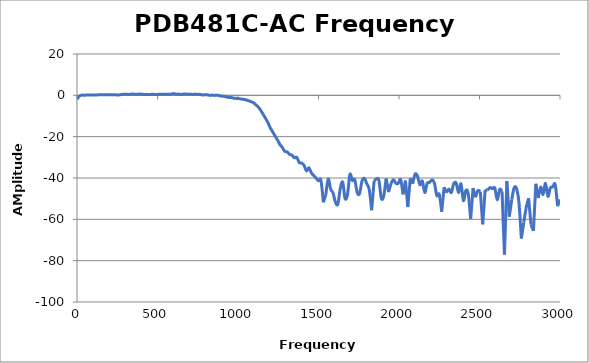
| Category | Series 0 |
|---|---|
| 0.3 | -1.872 |
| 15.2985 | -0.364 |
| 30.297 | 0.108 |
| 45.2955 | 0 |
| 60.294 | 0.183 |
| 75.2925 | 0.119 |
| 90.291 | 0.217 |
| 105.289 | 0.18 |
| 120.288 | 0.121 |
| 135.287 | 0.323 |
| 150.285 | 0.28 |
| 165.284 | 0.275 |
| 180.282 | 0.239 |
| 195.281 | 0.303 |
| 210.279 | 0.24 |
| 225.278 | 0.317 |
| 240.276 | 0.277 |
| 255.274 | 0.129 |
| 270.273 | 0.338 |
| 285.272 | 0.496 |
| 300.27 | 0.551 |
| 315.269 | 0.462 |
| 330.267 | 0.48 |
| 345.266 | 0.646 |
| 360.264 | 0.506 |
| 375.263 | 0.474 |
| 390.261 | 0.644 |
| 405.26 | 0.505 |
| 420.258 | 0.417 |
| 435.257 | 0.407 |
| 450.255 | 0.339 |
| 465.254 | 0.511 |
| 480.252 | 0.451 |
| 495.251 | 0.391 |
| 510.249 | 0.506 |
| 525.248 | 0.515 |
| 540.246 | 0.464 |
| 555.245 | 0.541 |
| 570.243 | 0.562 |
| 585.242 | 0.611 |
| 600.24 | 0.834 |
| 615.239 | 0.574 |
| 630.237 | 0.606 |
| 645.236 | 0.44 |
| 660.234 | 0.584 |
| 675.233 | 0.611 |
| 690.231 | 0.559 |
| 705.23 | 0.574 |
| 720.228 | 0.438 |
| 735.227 | 0.593 |
| 750.225 | 0.458 |
| 765.224 | 0.465 |
| 780.222 | 0.182 |
| 795.221 | 0.298 |
| 810.219 | 0.255 |
| 825.217 | -0.027 |
| 840.216 | 0.114 |
| 855.215 | -0.041 |
| 870.213 | 0.1 |
| 885.212 | -0.189 |
| 900.21 | -0.414 |
| 915.209 | -0.495 |
| 930.207 | -0.841 |
| 945.206 | -1.009 |
| 960.204 | -1.11 |
| 975.203 | -1.358 |
| 990.201 | -1.484 |
| 1005.2 | -1.559 |
| 1020.2 | -1.809 |
| 1035.2 | -1.921 |
| 1050.2 | -2.244 |
| 1065.19 | -2.606 |
| 1080.19 | -3.038 |
| 1095.19 | -3.515 |
| 1110.19 | -4.521 |
| 1125.19 | -5.61 |
| 1140.19 | -7.161 |
| 1155.19 | -9.089 |
| 1170.18 | -11.038 |
| 1185.18 | -13.131 |
| 1200.18 | -15.678 |
| 1215.18 | -17.662 |
| 1230.18 | -19.681 |
| 1245.18 | -21.585 |
| 1260.17 | -23.773 |
| 1275.17 | -25.226 |
| 1290.17 | -27.07 |
| 1305.17 | -27.368 |
| 1320.17 | -28.558 |
| 1335.17 | -28.951 |
| 1350.17 | -30.249 |
| 1365.16 | -29.988 |
| 1380.16 | -32.517 |
| 1395.16 | -32.796 |
| 1410.16 | -33.85 |
| 1425.16 | -36.584 |
| 1440.16 | -35.028 |
| 1455.16 | -37.396 |
| 1470.15 | -38.806 |
| 1485.15 | -40.083 |
| 1500.15 | -41.346 |
| 1515.15 | -41.13 |
| 1530.15 | -51.759 |
| 1545.15 | -48.193 |
| 1560.14 | -40.525 |
| 1575.14 | -45.349 |
| 1590.14 | -47.23 |
| 1605.14 | -51.652 |
| 1620.14 | -52.633 |
| 1635.14 | -45.167 |
| 1650.14 | -41.98 |
| 1665.13 | -49.95 |
| 1680.13 | -47.955 |
| 1695.13 | -38.245 |
| 1710.13 | -41.137 |
| 1725.13 | -40.838 |
| 1740.13 | -47.031 |
| 1755.12 | -47.505 |
| 1770.12 | -41.475 |
| 1785.12 | -40.2 |
| 1800.12 | -42.837 |
| 1815.12 | -45.61 |
| 1830.12 | -55.594 |
| 1845.12 | -41.489 |
| 1860.11 | -40.45 |
| 1875.11 | -41.195 |
| 1890.11 | -49.722 |
| 1905.11 | -48.725 |
| 1920.11 | -40.266 |
| 1935.11 | -46.824 |
| 1950.11 | -42.849 |
| 1965.1 | -40.803 |
| 1980.1 | -42.513 |
| 1995.1 | -42.611 |
| 2010.1 | -40.755 |
| 2025.1 | -47.937 |
| 2040.1 | -41.25 |
| 2055.1 | -54.066 |
| 2070.09 | -40.128 |
| 2085.09 | -42.739 |
| 2100.09 | -38.09 |
| 2115.09 | -39.144 |
| 2130.09 | -43.309 |
| 2145.09 | -41.459 |
| 2160.08 | -47.038 |
| 2175.08 | -42.557 |
| 2190.08 | -42.103 |
| 2205.08 | -40.94 |
| 2220.08 | -42.58 |
| 2235.08 | -48.531 |
| 2250.08 | -47.949 |
| 2265.07 | -56.328 |
| 2280.07 | -44.499 |
| 2295.07 | -47.084 |
| 2310.07 | -45.317 |
| 2325.07 | -47.035 |
| 2340.07 | -42.751 |
| 2355.07 | -42.454 |
| 2370.06 | -47.143 |
| 2385.06 | -42.797 |
| 2400.06 | -50.972 |
| 2415.06 | -46.092 |
| 2430.06 | -47.678 |
| 2445.06 | -59.813 |
| 2460.05 | -44.837 |
| 2475.05 | -49.331 |
| 2490.05 | -46.105 |
| 2505.05 | -46.677 |
| 2520.05 | -62.41 |
| 2535.05 | -45.796 |
| 2550.05 | -45.896 |
| 2565.04 | -44.646 |
| 2580.04 | -45.154 |
| 2595.04 | -44.839 |
| 2610.04 | -50.512 |
| 2625.04 | -45.533 |
| 2640.04 | -46.425 |
| 2655.04 | -77.075 |
| 2670.03 | -41.483 |
| 2685.03 | -58.714 |
| 2700.03 | -50.521 |
| 2715.03 | -44.76 |
| 2730.03 | -45.068 |
| 2745.03 | -51.94 |
| 2760.02 | -69.257 |
| 2775.02 | -61.599 |
| 2790.02 | -54.327 |
| 2805.02 | -49.82 |
| 2820.02 | -62.614 |
| 2835.02 | -65.563 |
| 2850.02 | -42.786 |
| 2865.01 | -49.699 |
| 2880.01 | -44.431 |
| 2895.01 | -47.933 |
| 2910.01 | -42.609 |
| 2925.01 | -48.878 |
| 2940.01 | -44.781 |
| 2955.0 | -44.332 |
| 2970.0 | -43.162 |
| 2985.0 | -53.635 |
| 3000.0 | -50.395 |